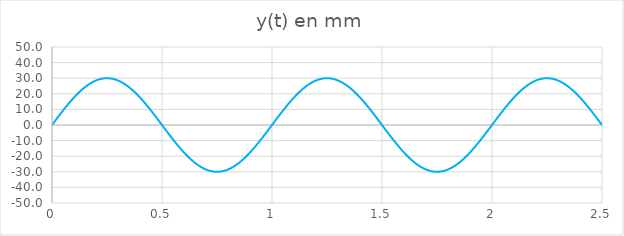
| Category | y(t) en mm |
|---|---|
| 0.0 | 0 |
| 0.025 | 4.693 |
| 0.05 | 9.271 |
| 0.075 | 13.62 |
| 0.1 | 17.634 |
| 0.125 | 21.213 |
| 0.15 | 24.271 |
| 0.175 | 26.73 |
| 0.2 | 28.532 |
| 0.225 | 29.631 |
| 0.25 | 30 |
| 0.275 | 29.631 |
| 0.3 | 28.532 |
| 0.325 | 26.73 |
| 0.35 | 24.271 |
| 0.375 | 21.213 |
| 0.4 | 17.634 |
| 0.425 | 13.62 |
| 0.45 | 9.271 |
| 0.475 | 4.693 |
| 0.5 | 0 |
| 0.525 | -4.693 |
| 0.55 | -9.271 |
| 0.575 | -13.62 |
| 0.6 | -17.634 |
| 0.625 | -21.213 |
| 0.65 | -24.271 |
| 0.675 | -26.73 |
| 0.7 | -28.532 |
| 0.725 | -29.631 |
| 0.75 | -30 |
| 0.775 | -29.631 |
| 0.8 | -28.532 |
| 0.825 | -26.73 |
| 0.85 | -24.271 |
| 0.875 | -21.213 |
| 0.9 | -17.634 |
| 0.925 | -13.62 |
| 0.95 | -9.271 |
| 0.975 | -4.693 |
| 1.0 | 0 |
| 1.025 | 4.693 |
| 1.05 | 9.271 |
| 1.075 | 13.62 |
| 1.1 | 17.634 |
| 1.125 | 21.213 |
| 1.15 | 24.271 |
| 1.175 | 26.73 |
| 1.2 | 28.532 |
| 1.225 | 29.631 |
| 1.25 | 30 |
| 1.275 | 29.631 |
| 1.3 | 28.532 |
| 1.325 | 26.73 |
| 1.35 | 24.271 |
| 1.375 | 21.213 |
| 1.4 | 17.634 |
| 1.425 | 13.62 |
| 1.45 | 9.271 |
| 1.475 | 4.693 |
| 1.5 | 0 |
| 1.525 | -4.693 |
| 1.55 | -9.271 |
| 1.575 | -13.62 |
| 1.6 | -17.634 |
| 1.625 | -21.213 |
| 1.65 | -24.271 |
| 1.675 | -26.73 |
| 1.7 | -28.532 |
| 1.725 | -29.631 |
| 1.75 | -30 |
| 1.775 | -29.631 |
| 1.8 | -28.532 |
| 1.825 | -26.73 |
| 1.85 | -24.271 |
| 1.875 | -21.213 |
| 1.9 | -17.634 |
| 1.925 | -13.62 |
| 1.95 | -9.271 |
| 1.975 | -4.693 |
| 2.0 | 0 |
| 2.025 | 4.693 |
| 2.05 | 9.271 |
| 2.075 | 13.62 |
| 2.1 | 17.634 |
| 2.125 | 21.213 |
| 2.15 | 24.271 |
| 2.175 | 26.73 |
| 2.2 | 28.532 |
| 2.225 | 29.631 |
| 2.25 | 30 |
| 2.275 | 29.631 |
| 2.3 | 28.532 |
| 2.325 | 26.73 |
| 2.35 | 24.271 |
| 2.375 | 21.213 |
| 2.4 | 17.634 |
| 2.425 | 13.62 |
| 2.45 | 9.271 |
| 2.475 | 4.693 |
| 2.5 | 0 |